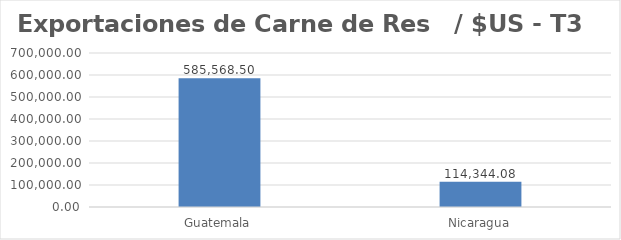
| Category | Series 0 |
|---|---|
| Guatemala | 585568.5 |
| Nicaragua | 114344.08 |